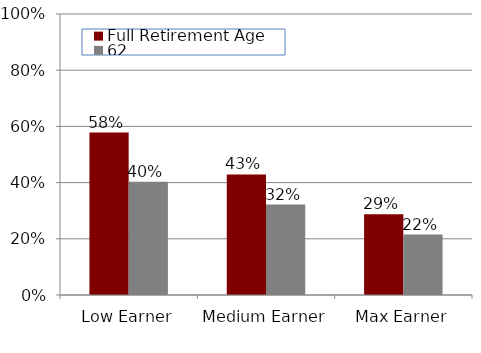
| Category | Full Retirement Age | 62 |
|---|---|---|
| Low Earner | 0.578 | 0.403 |
| Medium Earner | 0.429 | 0.322 |
| Max Earner | 0.287 | 0.215 |